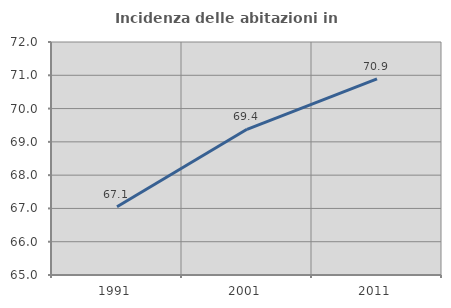
| Category | Incidenza delle abitazioni in proprietà  |
|---|---|
| 1991.0 | 67.051 |
| 2001.0 | 69.378 |
| 2011.0 | 70.891 |